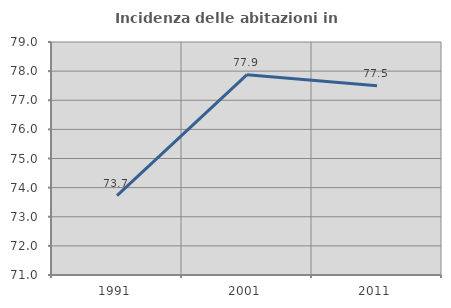
| Category | Incidenza delle abitazioni in proprietà  |
|---|---|
| 1991.0 | 73.723 |
| 2001.0 | 77.879 |
| 2011.0 | 77.495 |